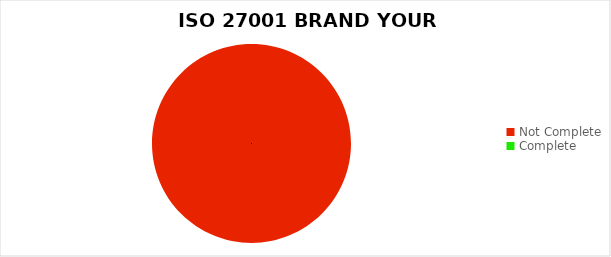
| Category | Series 0 |
|---|---|
| Not Complete | 1 |
| Complete | 0 |